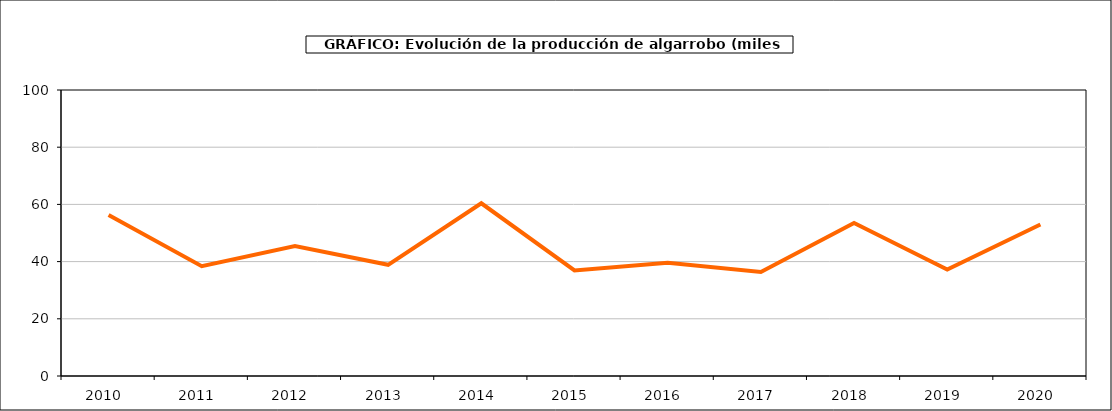
| Category | producción |
|---|---|
| 2010.0 | 56.286 |
| 2011.0 | 38.38 |
| 2012.0 | 45.414 |
| 2013.0 | 38.882 |
| 2014.0 | 60.4 |
| 2015.0 | 36.894 |
| 2016.0 | 39.587 |
| 2017.0 | 36.368 |
| 2018.0 | 53.477 |
| 2019.0 | 37.246 |
| 2020.0 | 52.989 |